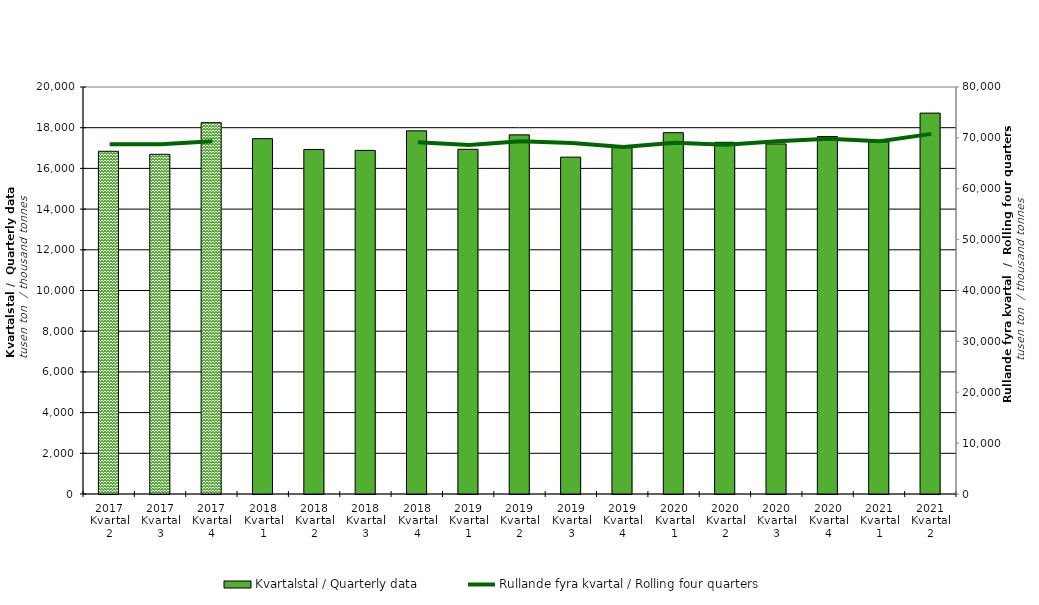
| Category | Kvartalstal / Quarterly data |
|---|---|
| 2017 Kvartal 2 | 16840.891 |
| 2017 Kvartal 3 | 16693.737 |
| 2017 Kvartal 4 | 18245.096 |
| 2018 Kvartal 1 | 17460.514 |
| 2018 Kvartal 2 | 16931.207 |
| 2018 Kvartal 3 | 16884.53 |
| 2018 Kvartal 4 | 17846.541 |
| 2019 Kvartal 1 | 16938.711 |
| 2019 Kvartal 2 | 17647.493 |
| 2019 Kvartal 3 | 16553.159 |
| 2019 Kvartal 4 | 17080.691 |
| 2020 Kvartal 1 | 17755.324 |
| 2020 Kvartal 2 | 17283.081 |
| 2020 Kvartal 3 | 17203.185 |
| 2020 Kvartal 4 | 17563.403 |
| 2021 Kvartal 1 | 17302.538 |
| 2021 Kvartal 2 | 18716.608 |